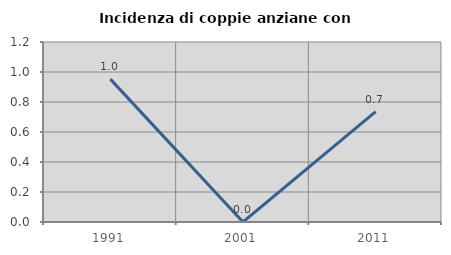
| Category | Incidenza di coppie anziane con figli |
|---|---|
| 1991.0 | 0.952 |
| 2001.0 | 0 |
| 2011.0 | 0.735 |